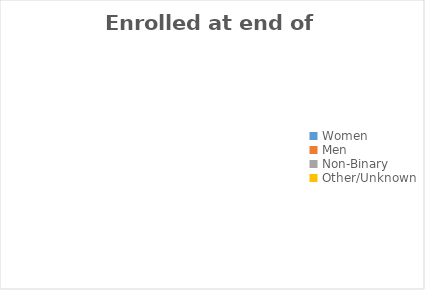
| Category | Enrolled at end of period |
|---|---|
| Women | 0 |
| Men | 0 |
| Non-Binary | 0 |
| Other/Unknown | 0 |